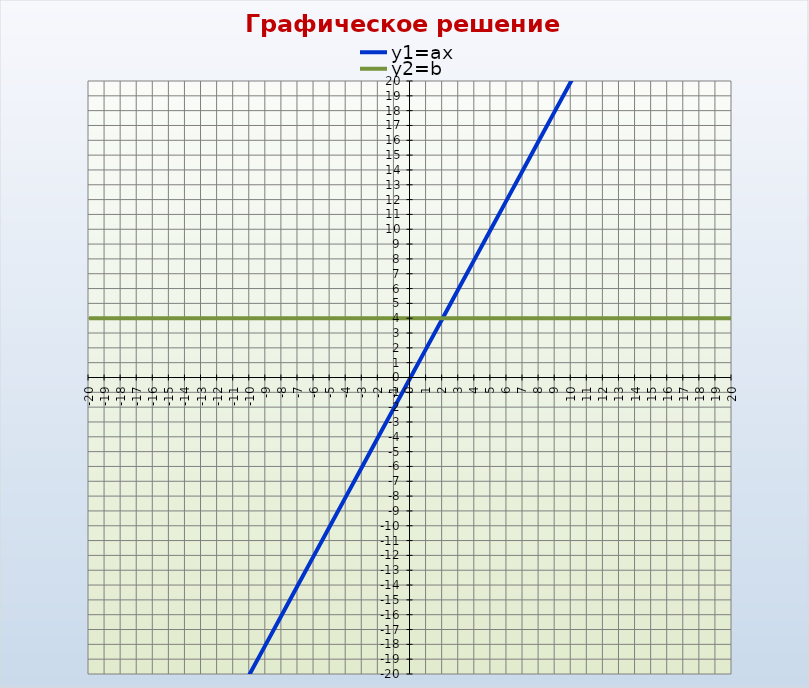
| Category | y1=ax | y2=b |
|---|---|---|
| -20.0 | -40 | 4 |
| -19.0 | -38 | 4 |
| -18.0 | -36 | 4 |
| -17.0 | -34 | 4 |
| -16.0 | -32 | 4 |
| -15.0 | -30 | 4 |
| -14.0 | -28 | 4 |
| -13.0 | -26 | 4 |
| -12.0 | -24 | 4 |
| -11.0 | -22 | 4 |
| -10.0 | -20 | 4 |
| -9.0 | -18 | 4 |
| -8.0 | -16 | 4 |
| -7.0 | -14 | 4 |
| -6.0 | -12 | 4 |
| -5.0 | -10 | 4 |
| -4.0 | -8 | 4 |
| -3.0 | -6 | 4 |
| -2.0 | -4 | 4 |
| -1.0 | -2 | 4 |
| 0.0 | 0 | 4 |
| 1.0 | 2 | 4 |
| 2.0 | 4 | 4 |
| 3.0 | 6 | 4 |
| 4.0 | 8 | 4 |
| 5.0 | 10 | 4 |
| 6.0 | 12 | 4 |
| 7.0 | 14 | 4 |
| 8.0 | 16 | 4 |
| 9.0 | 18 | 4 |
| 10.0 | 20 | 4 |
| 11.0 | 22 | 4 |
| 12.0 | 24 | 4 |
| 13.0 | 26 | 4 |
| 14.0 | 28 | 4 |
| 15.0 | 30 | 4 |
| 16.0 | 32 | 4 |
| 17.0 | 34 | 4 |
| 18.0 | 36 | 4 |
| 19.0 | 38 | 4 |
| 20.0 | 40 | 4 |